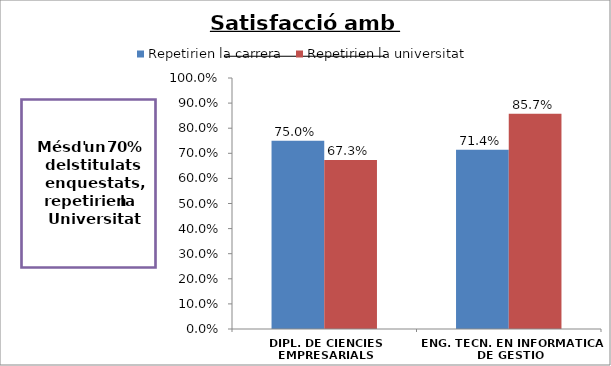
| Category | Repetirien la carrera | Repetirien la universitat |
|---|---|---|
| DIPL. DE CIENCIES EMPRESARIALS | 0.75 | 0.673 |
| ENG. TECN. EN INFORMATICA DE GESTIO | 0.714 | 0.857 |